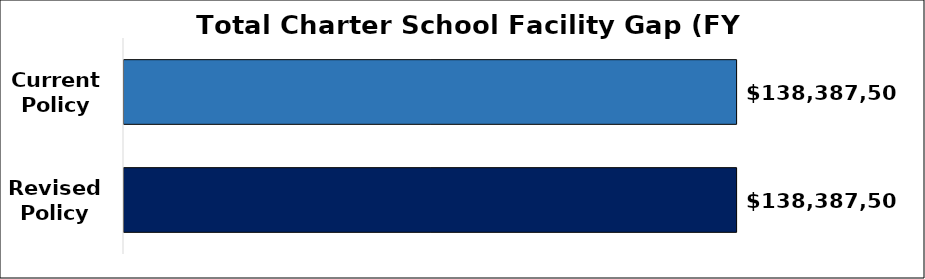
| Category | Facility Gap Funding Amount |
|---|---|
| Current
Policy | 138387505.528 |
| Revised
Policy | 138387505.528 |